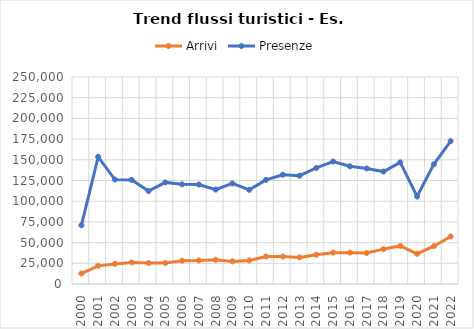
| Category | Arrivi | Presenze |
|---|---|---|
| 2000.0 | 12657 | 70859 |
| 2001.0 | 21923 | 153497 |
| 2002.0 | 24255 | 126157 |
| 2003.0 | 26044 | 125736 |
| 2004.0 | 25316 | 112209 |
| 2005.0 | 25330 | 122704 |
| 2006.0 | 28207 | 120379 |
| 2007.0 | 28460 | 120064 |
| 2008.0 | 29224 | 114027 |
| 2009.0 | 27309 | 121470 |
| 2010.0 | 28459 | 113740 |
| 2011.0 | 33308 | 125716 |
| 2012.0 | 33185 | 131982 |
| 2013.0 | 32127 | 130787 |
| 2014.0 | 35369 | 140159 |
| 2015.0 | 37864 | 147906 |
| 2016.0 | 37886 | 142183 |
| 2017.0 | 37382 | 139549 |
| 2018.0 | 42088 | 135772 |
| 2019.0 | 45981 | 146868 |
| 2020.0 | 36470 | 105682 |
| 2021.0 | 45673 | 144577 |
| 2022.0 | 57400 | 172500 |